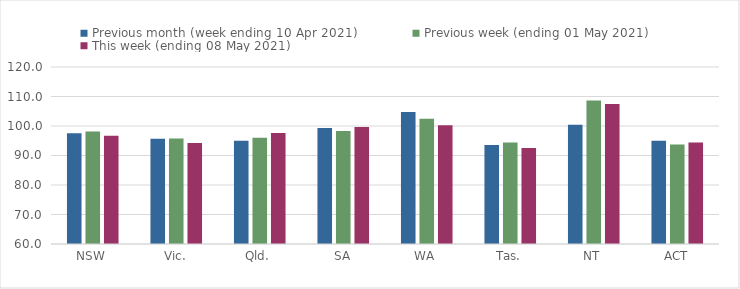
| Category | Previous month (week ending 10 Apr 2021) | Previous week (ending 01 May 2021) | This week (ending 08 May 2021) |
|---|---|---|---|
| NSW | 97.57 | 98.13 | 96.69 |
| Vic. | 95.64 | 95.75 | 94.27 |
| Qld. | 95 | 96.05 | 97.61 |
| SA | 99.35 | 98.32 | 99.67 |
| WA | 104.78 | 102.42 | 100.25 |
| Tas. | 93.6 | 94.41 | 92.53 |
| NT | 100.4 | 108.67 | 107.45 |
| ACT | 94.99 | 93.72 | 94.4 |